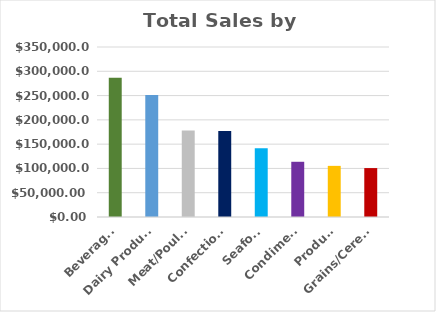
| Category | Total |
|---|---|
| Beverages | 286526.95 |
| Dairy Products | 251330.5 |
| Meat/Poultry | 178188.8 |
| Confections | 177099.1 |
| Seafood | 141623.09 |
| Condiments | 113694.75 |
| Produce | 105268.6 |
| Grains/Cereals | 100726.8 |